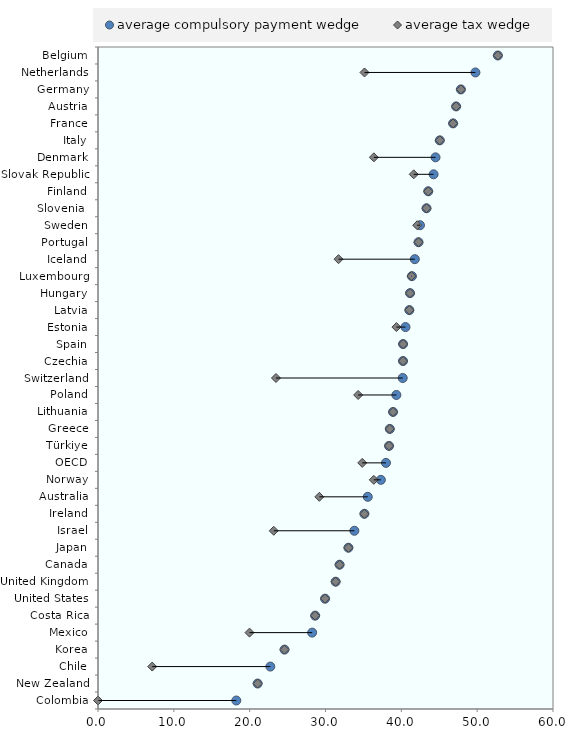
| Category | blankName |
|---|---|
| Colombia | 0 |
| New Zealand | 21.053 |
| Chile | 7.149 |
| Korea | 24.596 |
| Mexico | 19.98 |
| Costa Rica | 28.633 |
| United States | 29.941 |
| United Kingdom | 31.338 |
| Canada | 31.857 |
| Japan | 33.02 |
| Israel | 23.178 |
| Ireland | 35.129 |
| Australia | 29.19 |
| Norway | 36.368 |
| OECD | 34.845 |
| Türkiye | 38.38 |
| Greece | 38.479 |
| Lithuania | 38.908 |
| Poland | 34.308 |
| Switzerland | 23.472 |
| Czechia | 40.22 |
| Spain | 40.228 |
| Estonia | 39.353 |
| Latvia | 41.058 |
| Hungary | 41.15 |
| Luxembourg | 41.331 |
| Iceland | 31.721 |
| Portugal | 42.264 |
| Sweden | 42.094 |
| Slovenia  | 43.321 |
| Finland | 43.547 |
| Slovak Republic | 41.633 |
| Denmark | 36.381 |
| Italy | 45.071 |
| France | 46.826 |
| Austria | 47.225 |
| Germany | 47.853 |
| Netherlands | 35.141 |
| Belgium | 52.729 |